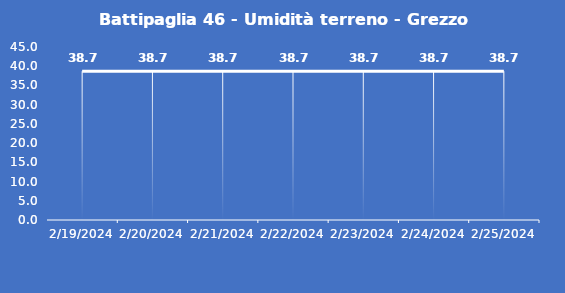
| Category | Battipaglia 46 - Umidità terreno - Grezzo (%VWC) |
|---|---|
| 2/19/24 | 38.7 |
| 2/20/24 | 38.7 |
| 2/21/24 | 38.7 |
| 2/22/24 | 38.7 |
| 2/23/24 | 38.7 |
| 2/24/24 | 38.7 |
| 2/25/24 | 38.7 |